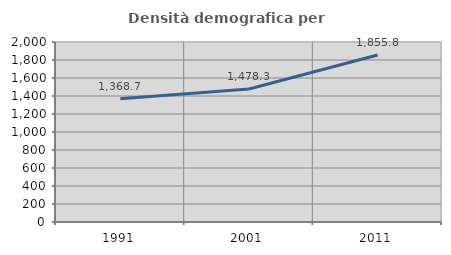
| Category | Densità demografica |
|---|---|
| 1991.0 | 1368.671 |
| 2001.0 | 1478.281 |
| 2011.0 | 1855.826 |